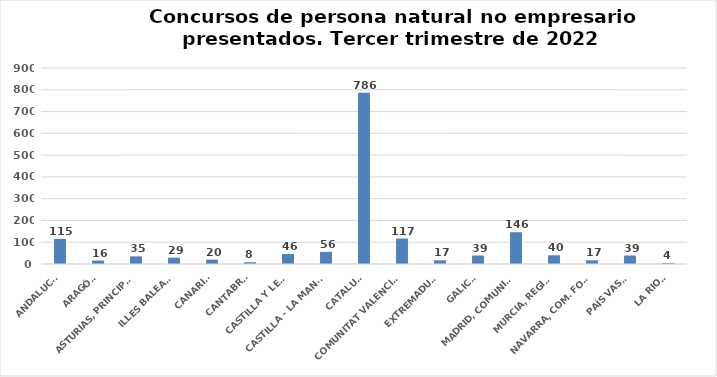
| Category | Series 0 |
|---|---|
| ANDALUCÍA | 115 |
| ARAGÓN | 16 |
| ASTURIAS, PRINCIPADO | 35 |
| ILLES BALEARS | 29 |
| CANARIAS | 20 |
| CANTABRIA | 8 |
| CASTILLA Y LEÓN | 46 |
| CASTILLA - LA MANCHA | 56 |
| CATALUÑA | 786 |
| COMUNITAT VALENCIANA | 117 |
| EXTREMADURA | 17 |
| GALICIA | 39 |
| MADRID, COMUNIDAD | 146 |
| MURCIA, REGIÓN | 40 |
| NAVARRA, COM. FORAL | 17 |
| PAÍS VASCO | 39 |
| LA RIOJA | 4 |